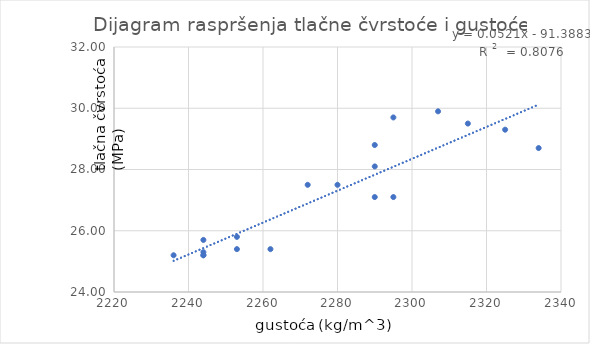
| Category | Tlačna čvrstoća |
|---|---|
| 2236.0 | 25.2 |
| 2244.0 | 25.2 |
| 2244.0 | 25.2 |
| 2244.0 | 25.3 |
| 2244.0 | 25.7 |
| 2253.0 | 25.4 |
| 2253.0 | 25.8 |
| 2262.0 | 25.4 |
| 2272.0 | 27.5 |
| 2280.0 | 27.5 |
| 2290.0 | 27.1 |
| 2290.0 | 28.1 |
| 2290.0 | 28.8 |
| 2295.0 | 27.1 |
| 2295.0 | 29.7 |
| 2307.0 | 29.9 |
| 2315.0 | 29.5 |
| 2325.0 | 29.3 |
| 2334.0 | 28.7 |